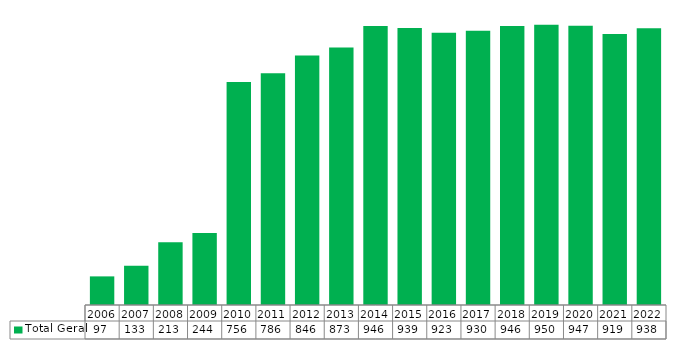
| Category | Total Geral |
|---|---|
| 2006.0 | 97 |
| 2007.0 | 133 |
| 2008.0 | 213 |
| 2009.0 | 244 |
| 2010.0 | 756 |
| 2011.0 | 786 |
| 2012.0 | 846 |
| 2013.0 | 873 |
| 2014.0 | 946 |
| 2015.0 | 939 |
| 2016.0 | 923 |
| 2017.0 | 930 |
| 2018.0 | 946 |
| 2019.0 | 950 |
| 2020.0 | 947 |
| 2021.0 | 919 |
| 2022.0 | 938 |